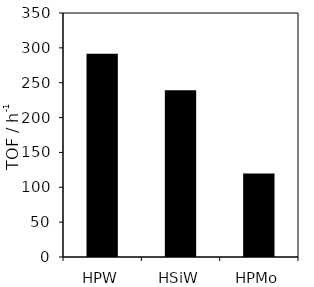
| Category | Series 0 |
|---|---|
| HPW | 291.602 |
| HSiW | 239.316 |
| HPMo | 119.789 |